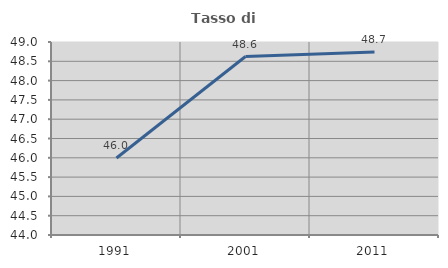
| Category | Tasso di occupazione   |
|---|---|
| 1991.0 | 45.994 |
| 2001.0 | 48.624 |
| 2011.0 | 48.742 |